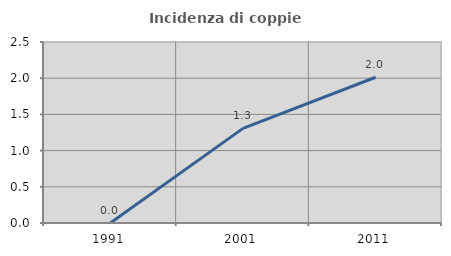
| Category | Incidenza di coppie miste |
|---|---|
| 1991.0 | 0 |
| 2001.0 | 1.307 |
| 2011.0 | 2.013 |